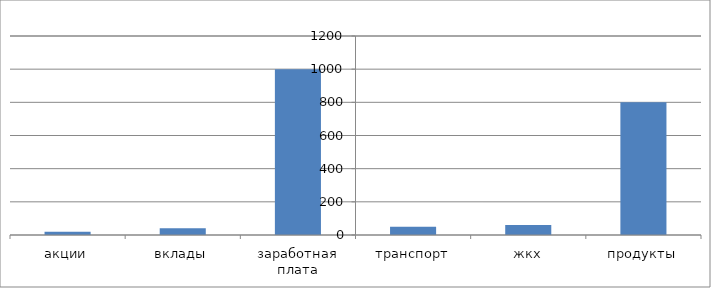
| Category | Series 0 |
|---|---|
| акции | 20 |
| вклады | 40 |
| заработная плата | 1000 |
| транспорт | 50 |
| жкх | 60 |
| продукты | 800 |